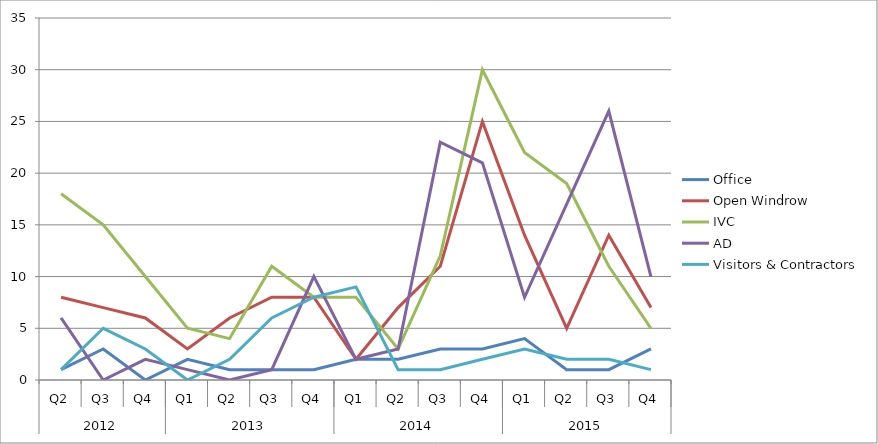
| Category | Office | Open Windrow | IVC | AD | Visitors & Contractors |
|---|---|---|---|---|---|
| 0 | 1 | 8 | 18 | 6 | 1 |
| 1 | 3 | 7 | 15 | 0 | 5 |
| 2 | 0 | 6 | 10 | 2 | 3 |
| 3 | 2 | 3 | 5 | 1 | 0 |
| 4 | 1 | 6 | 4 | 0 | 2 |
| 5 | 1 | 8 | 11 | 1 | 6 |
| 6 | 1 | 8 | 8 | 10 | 8 |
| 7 | 2 | 2 | 8 | 2 | 9 |
| 8 | 2 | 7 | 3 | 3 | 1 |
| 9 | 3 | 11 | 12 | 23 | 1 |
| 10 | 3 | 25 | 30 | 21 | 2 |
| 11 | 4 | 14 | 22 | 8 | 3 |
| 12 | 1 | 5 | 19 | 17 | 2 |
| 13 | 1 | 14 | 11 | 26 | 2 |
| 14 | 3 | 7 | 5 | 10 | 1 |